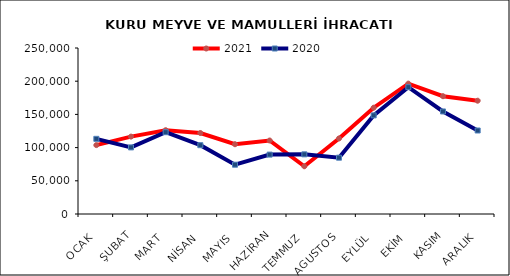
| Category | 2021 | 2020 |
|---|---|---|
| OCAK | 103743.56 | 113205.425 |
| ŞUBAT | 116565.357 | 100301.63 |
| MART | 126169.392 | 123199.154 |
| NİSAN | 121973.272 | 103631.957 |
| MAYIS | 105055.89 | 74239.044 |
| HAZİRAN | 110671.376 | 89459.7 |
| TEMMUZ | 71868.762 | 89853.851 |
| AGUSTOS | 113779.624 | 84827.393 |
| EYLÜL | 160083.734 | 148527.731 |
| EKİM | 196357.147 | 191052 |
| KASIM | 177391.311 | 154427.121 |
| ARALIK | 170627.442 | 125746.174 |